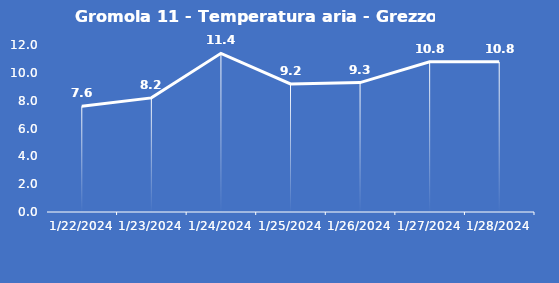
| Category | Gromola 11 - Temperatura aria - Grezzo (°C) |
|---|---|
| 1/22/24 | 7.6 |
| 1/23/24 | 8.2 |
| 1/24/24 | 11.4 |
| 1/25/24 | 9.2 |
| 1/26/24 | 9.3 |
| 1/27/24 | 10.8 |
| 1/28/24 | 10.8 |